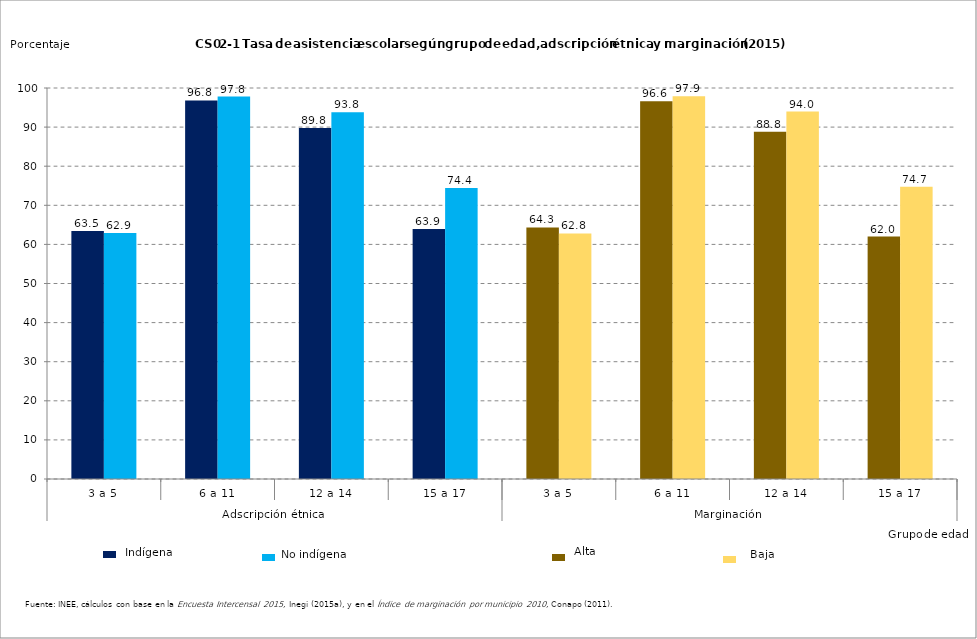
| Category | Series 0 | Series 1 |
|---|---|---|
| 0 | 63.45 | 62.93 |
| 1 | 96.83 | 97.82 |
| 2 | 89.79 | 93.79 |
| 3 | 63.93 | 74.4 |
| 4 | 64.34 | 62.8 |
| 5 | 96.59 | 97.86 |
| 6 | 88.81 | 93.96 |
| 7 | 62.01 | 74.73 |